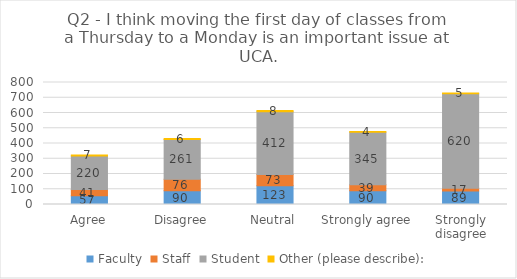
| Category | Faculty | Staff | Student | Other (please describe): |
|---|---|---|---|---|
| Agree | 57 | 41 | 220 | 7 |
| Disagree | 90 | 76 | 261 | 6 |
| Neutral | 123 | 73 | 412 | 8 |
| Strongly agree | 90 | 39 | 345 | 4 |
| Strongly disagree | 89 | 17 | 620 | 5 |